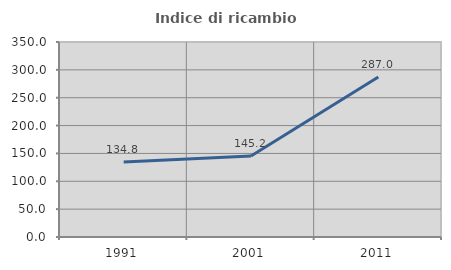
| Category | Indice di ricambio occupazionale  |
|---|---|
| 1991.0 | 134.783 |
| 2001.0 | 145.238 |
| 2011.0 | 287.037 |